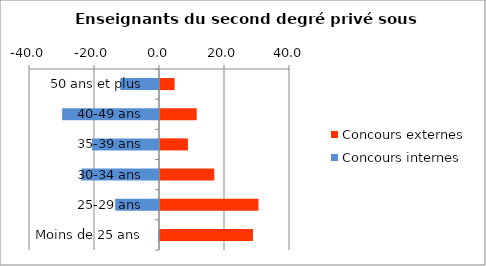
| Category | Concours externes | Concours internes |
|---|---|---|
| 50 ans et plus | 4.5 | -11.9 |
| 40-49 ans | 11.3 | -29.8 |
| 35-39 ans | 8.6 | -20.6 |
| 30-34 ans | 16.7 | -23.9 |
| 25-29 ans | 30.3 | -13.5 |
| Moins de 25 ans | 28.6 | -0.2 |